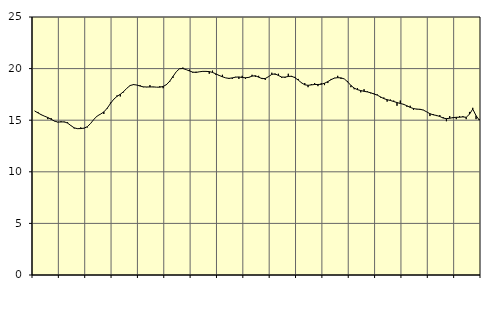
| Category | Piggar | Series 1 |
|---|---|---|
| nan | 15.9 | 15.89 |
| 87.0 | 15.8 | 15.71 |
| 87.0 | 15.5 | 15.53 |
| 87.0 | 15.4 | 15.39 |
| nan | 15.1 | 15.26 |
| 88.0 | 15.2 | 15.09 |
| 88.0 | 14.9 | 14.92 |
| 88.0 | 14.8 | 14.82 |
| nan | 14.9 | 14.83 |
| 89.0 | 14.8 | 14.84 |
| 89.0 | 14.8 | 14.72 |
| 89.0 | 14.5 | 14.48 |
| nan | 14.2 | 14.26 |
| 90.0 | 14.2 | 14.18 |
| 90.0 | 14.3 | 14.19 |
| 90.0 | 14.2 | 14.23 |
| nan | 14.3 | 14.37 |
| 91.0 | 14.7 | 14.69 |
| 91.0 | 15.1 | 15.09 |
| 91.0 | 15.4 | 15.41 |
| nan | 15.6 | 15.59 |
| 92.0 | 15.6 | 15.8 |
| 92.0 | 16.1 | 16.15 |
| 92.0 | 16.7 | 16.61 |
| nan | 17 | 17.03 |
| 93.0 | 17.4 | 17.31 |
| 93.0 | 17.3 | 17.51 |
| 93.0 | 17.7 | 17.77 |
| nan | 18.1 | 18.1 |
| 94.0 | 18.4 | 18.36 |
| 94.0 | 18.5 | 18.45 |
| 94.0 | 18.4 | 18.41 |
| nan | 18.4 | 18.31 |
| 95.0 | 18.2 | 18.23 |
| 95.0 | 18.2 | 18.22 |
| 95.0 | 18.4 | 18.22 |
| nan | 18.2 | 18.23 |
| 96.0 | 18.2 | 18.2 |
| 96.0 | 18.3 | 18.2 |
| 96.0 | 18.1 | 18.27 |
| nan | 18.5 | 18.44 |
| 97.0 | 18.7 | 18.78 |
| 97.0 | 19.1 | 19.24 |
| 97.0 | 19.7 | 19.7 |
| nan | 20 | 19.99 |
| 98.0 | 20.1 | 20.01 |
| 98.0 | 19.9 | 19.9 |
| 98.0 | 19.9 | 19.77 |
| nan | 19.6 | 19.66 |
| 99.0 | 19.7 | 19.63 |
| 99.0 | 19.7 | 19.69 |
| 99.0 | 19.7 | 19.73 |
| nan | 19.7 | 19.73 |
| 0.0 | 19.5 | 19.71 |
| 0.0 | 19.8 | 19.63 |
| 0.0 | 19.4 | 19.49 |
| nan | 19.3 | 19.34 |
| 1.0 | 19.4 | 19.21 |
| 1.0 | 19.1 | 19.1 |
| 1.0 | 19 | 19.05 |
| nan | 19 | 19.1 |
| 2.0 | 19.2 | 19.17 |
| 2.0 | 19 | 19.19 |
| 2.0 | 19.3 | 19.14 |
| nan | 19 | 19.11 |
| 3.0 | 19.1 | 19.15 |
| 3.0 | 19.4 | 19.27 |
| 3.0 | 19.2 | 19.31 |
| nan | 19.3 | 19.17 |
| 4.0 | 19.1 | 19.03 |
| 4.0 | 18.9 | 19.04 |
| 4.0 | 19.2 | 19.22 |
| nan | 19.6 | 19.44 |
| 5.0 | 19.4 | 19.49 |
| 5.0 | 19.5 | 19.33 |
| 5.0 | 19.1 | 19.18 |
| nan | 19.1 | 19.17 |
| 6.0 | 19.5 | 19.24 |
| 6.0 | 19.2 | 19.26 |
| 6.0 | 19.2 | 19.12 |
| nan | 19 | 18.89 |
| 7.0 | 18.6 | 18.63 |
| 7.0 | 18.6 | 18.43 |
| 7.0 | 18.2 | 18.38 |
| nan | 18.5 | 18.42 |
| 8.0 | 18.6 | 18.46 |
| 8.0 | 18.3 | 18.46 |
| 8.0 | 18.6 | 18.48 |
| nan | 18.4 | 18.58 |
| 9.0 | 18.6 | 18.74 |
| 9.0 | 19 | 18.93 |
| 9.0 | 19.1 | 19.08 |
| nan | 19.3 | 19.12 |
| 10.0 | 19 | 19.1 |
| 10.0 | 19 | 19 |
| 10.0 | 18.8 | 18.72 |
| nan | 18.2 | 18.37 |
| 11.0 | 18 | 18.11 |
| 11.0 | 18.1 | 17.96 |
| 11.0 | 17.7 | 17.87 |
| nan | 18 | 17.8 |
| 12.0 | 17.8 | 17.74 |
| 12.0 | 17.6 | 17.66 |
| 12.0 | 17.6 | 17.54 |
| nan | 17.5 | 17.43 |
| 13.0 | 17.2 | 17.26 |
| 13.0 | 17.2 | 17.09 |
| 13.0 | 16.8 | 16.99 |
| nan | 17 | 16.91 |
| 14.0 | 16.9 | 16.81 |
| 14.0 | 16.4 | 16.71 |
| 14.0 | 16.9 | 16.62 |
| nan | 16.5 | 16.54 |
| 15.0 | 16.3 | 16.4 |
| 15.0 | 16.4 | 16.24 |
| 15.0 | 16 | 16.13 |
| nan | 16.1 | 16.07 |
| 16.0 | 16 | 16.06 |
| 16.0 | 16 | 15.98 |
| 16.0 | 15.8 | 15.81 |
| nan | 15.4 | 15.63 |
| 17.0 | 15.6 | 15.52 |
| 17.0 | 15.4 | 15.46 |
| 17.0 | 15.5 | 15.36 |
| nan | 15.3 | 15.21 |
| 18.0 | 14.9 | 15.15 |
| 18.0 | 15.4 | 15.19 |
| 18.0 | 15.2 | 15.25 |
| nan | 15.1 | 15.28 |
| 19.0 | 15.4 | 15.29 |
| 19.0 | 15.4 | 15.32 |
| 19.0 | 15.1 | 15.28 |
| nan | 15.8 | 15.58 |
| 20.0 | 16.2 | 16.08 |
| 20.0 | 15.1 | 15.44 |
| 20.0 | 15.1 | 15 |